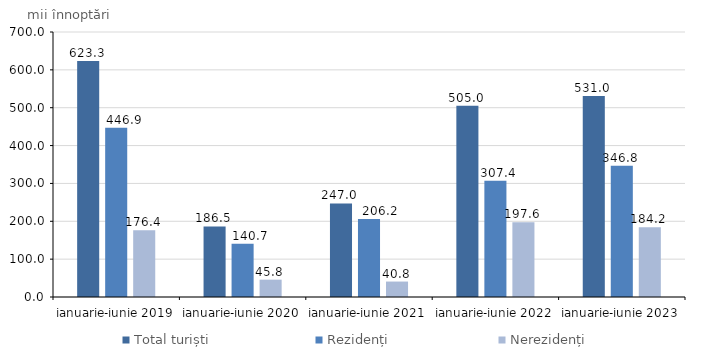
| Category | Total turiști | Rezidenți  | Nerezidenți |
|---|---|---|---|
| ianuarie-iunie 2019 | 623.3 | 446.9 | 176.4 |
| ianuarie-iunie 2020 | 186.5 | 140.7 | 45.8 |
| ianuarie-iunie 2021 | 247 | 206.2 | 40.8 |
| ianuarie-iunie 2022 | 505 | 307.4 | 197.6 |
| ianuarie-iunie 2023 | 531 | 346.8 | 184.2 |